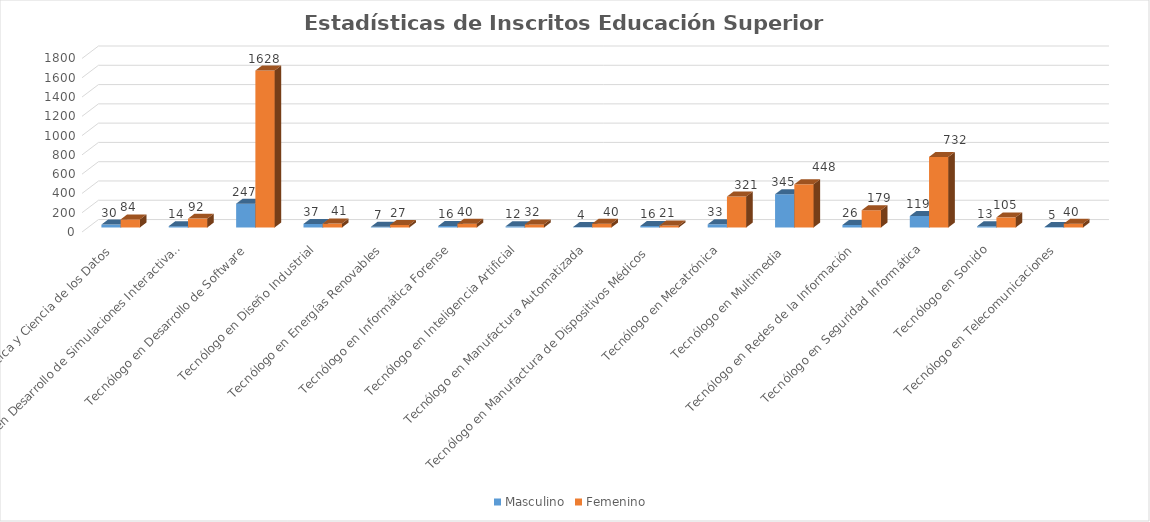
| Category | Masculino | Femenino  |
|---|---|---|
| Tecnólogo en Analítica y Ciencia de los Datos | 30 | 84 |
| Tecnólogo en Desarrollo de Simulaciones Interactivas y Videojuegos | 14 | 92 |
| Tecnólogo en Desarrollo de Software | 247 | 1628 |
| Tecnólogo en Diseño Industrial | 37 | 41 |
| Tecnólogo en Energías Renovables | 7 | 27 |
| Tecnólogo en Informática Forense | 16 | 40 |
| Tecnólogo en Inteligencia Artificial | 12 | 32 |
| Tecnólogo en Manufactura Automatizada | 4 | 40 |
| Tecnólogo en Manufactura de Dispositivos Médicos  | 16 | 21 |
| Tecnólogo en Mecatrónica | 33 | 321 |
| Tecnólogo en Multimedia  | 345 | 448 |
| Tecnólogo en Redes de la Información | 26 | 179 |
| Tecnólogo en Seguridad Informática | 119 | 732 |
| Tecnólogo en Sonido | 13 | 105 |
| Tecnólogo en Telecomunicaciones | 5 | 40 |